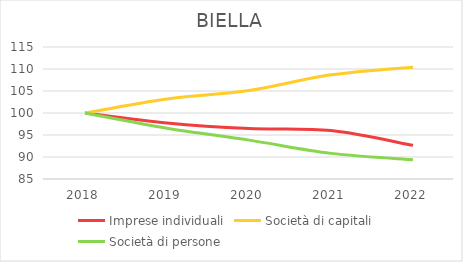
| Category | Imprese individuali | Società di capitali | Società di persone |
|---|---|---|---|
| 2018.0 | 100 | 100 | 100 |
| 2019.0 | 97.739 | 103.185 | 96.545 |
| 2020.0 | 96.467 | 105.103 | 93.836 |
| 2021.0 | 96.011 | 108.686 | 90.824 |
| 2022.0 | 92.648 | 110.423 | 89.386 |